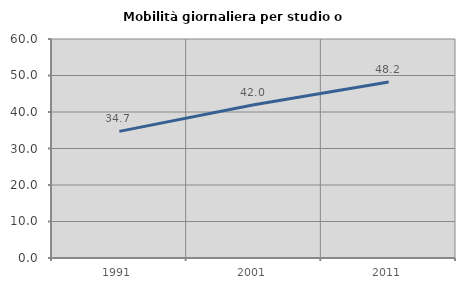
| Category | Mobilità giornaliera per studio o lavoro |
|---|---|
| 1991.0 | 34.685 |
| 2001.0 | 41.996 |
| 2011.0 | 48.194 |